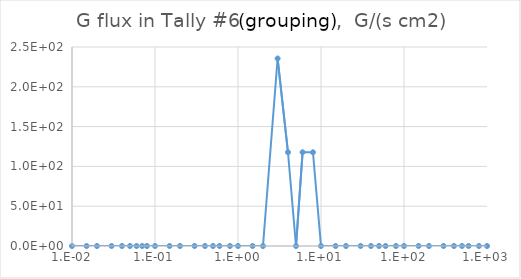
| Category | Series 0 |
|---|---|
| 0.01 | 0 |
| 0.015 | 0 |
| 0.02 | 0 |
| 0.03 | 0 |
| 0.04 | 0 |
| 0.05 | 0 |
| 0.06 | 0 |
| 0.07 | 0 |
| 0.08 | 0 |
| 0.1 | 0 |
| 0.15 | 0 |
| 0.2 | 0 |
| 0.3 | 0 |
| 0.4 | 0 |
| 0.5 | 0 |
| 0.6 | 0 |
| 0.8 | 0 |
| 1.0 | 0 |
| 1.5 | 6.332 |
| 2.0 | 18.994 |
| 3.0 | 75.978 |
| 4.0 | 167.784 |
| 5.0 | 148.789 |
| 6.0 | 60.149 |
| 8.0 | 39.572 |
| 10.0 | 9.497 |
| 15.0 | 5.065 |
| 20.0 | 0 |
| 30.0 | 0 |
| 40.0 | 0 |
| 50.0 | 0 |
| 60.0 | 0 |
| 80.0 | 0 |
| 100.0 | 0 |
| 150.0 | 0 |
| 200.0 | 0 |
| 300.0 | 0 |
| 400.0 | 0 |
| 500.0 | 0 |
| 600.0 | 0 |
| 800.0 | 0 |
| 1000.0 | 0 |
| 1500.0 | 0 |
| 2000.0 | 0 |
| 3000.0 | 0 |
| 4000.0 | 0 |
| 5000.0 | 0 |
| 6000.0 | 0 |
| 8000.0 | 0 |
| 10000.0 | 0 |